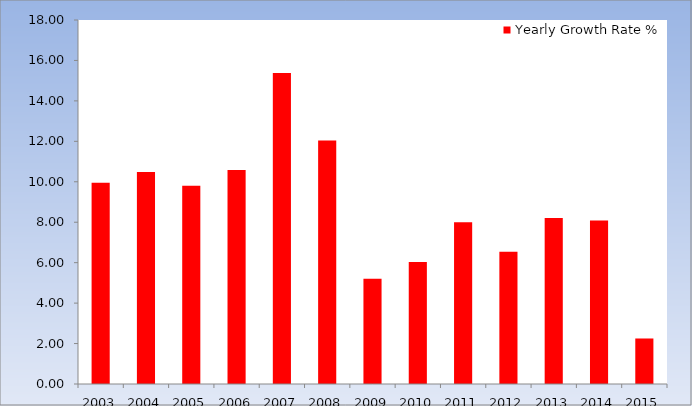
| Category | Yearly Growth Rate % |
|---|---|
| 2003.0 | 9.955 |
| 2004.0 | 10.478 |
| 2005.0 | 9.799 |
| 2006.0 | 10.588 |
| 2007.0 | 15.374 |
| 2008.0 | 12.041 |
| 2009.0 | 5.204 |
| 2010.0 | 6.034 |
| 2011.0 | 7.998 |
| 2012.0 | 6.539 |
| 2013.0 | 8.204 |
| 2014.0 | 8.083 |
| 2015.0 | 2.251 |